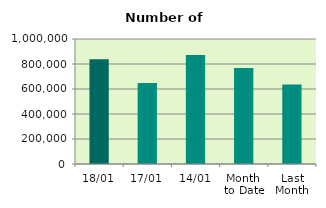
| Category | Series 0 |
|---|---|
| 18/01 | 837078 |
| 17/01 | 648830 |
| 14/01 | 872480 |
| Month 
to Date | 767144.833 |
| Last
Month | 635205.478 |